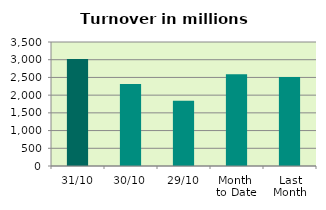
| Category | Series 0 |
|---|---|
| 31/10 | 3019.234 |
| 30/10 | 2315.337 |
| 29/10 | 1839.729 |
| Month 
to Date | 2586.958 |
| Last
Month | 2513.15 |